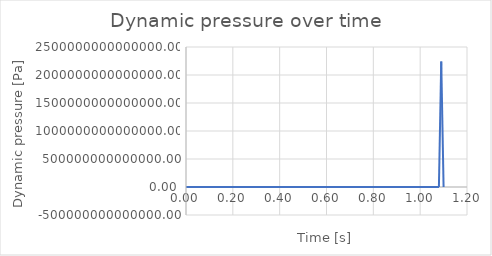
| Category | Series 0 |
|---|---|
| 0.0 | 119253.87 |
| 0.01 | 116545.592 |
| 0.02 | 95735.34 |
| 0.03 | 57701.717 |
| 0.04 | 25837.744 |
| 0.05 | 10615.93 |
| 0.060000000000000005 | 4652.437 |
| 0.07 | 2567.256 |
| 0.08 | 1587.92 |
| 0.09 | 1059.674 |
| 0.09999999999999999 | 749.017 |
| 0.10999999999999999 | 554.877 |
| 0.11999999999999998 | 427.903 |
| 0.12999999999999998 | 341.877 |
| 0.13999999999999999 | 281.954 |
| 0.15 | 239.293 |
| 0.16 | 208.404 |
| 0.17 | 185.759 |
| 0.18000000000000002 | 169.015 |
| 0.19000000000000003 | 156.572 |
| 0.20000000000000004 | 147.313 |
| 0.21000000000000005 | 140.433 |
| 0.22000000000000006 | 135.344 |
| 0.23000000000000007 | 131.606 |
| 0.24000000000000007 | 128.885 |
| 0.25000000000000006 | 126.929 |
| 0.26000000000000006 | 125.539 |
| 0.2700000000000001 | 124.568 |
| 0.2800000000000001 | 123.899 |
| 0.2900000000000001 | 123.447 |
| 0.3000000000000001 | 123.146 |
| 0.3100000000000001 | 122.95 |
| 0.3200000000000001 | 122.825 |
| 0.3300000000000001 | 122.746 |
| 0.34000000000000014 | 122.698 |
| 0.35000000000000014 | 122.669 |
| 0.36000000000000015 | 122.652 |
| 0.37000000000000016 | 122.642 |
| 0.38000000000000017 | 122.637 |
| 0.3900000000000002 | 122.634 |
| 0.4000000000000002 | 122.632 |
| 0.4100000000000002 | 122.631 |
| 0.4200000000000002 | 122.63 |
| 0.4300000000000002 | 122.63 |
| 0.4400000000000002 | 122.63 |
| 0.45000000000000023 | 122.63 |
| 0.46000000000000024 | 122.629 |
| 0.47000000000000025 | 122.629 |
| 0.48000000000000026 | 122.629 |
| 0.49000000000000027 | 122.629 |
| 0.5000000000000002 | 122.629 |
| 0.5100000000000002 | 122.629 |
| 0.5200000000000002 | 122.629 |
| 0.5300000000000002 | 122.629 |
| 0.5400000000000003 | 122.629 |
| 0.5500000000000003 | 122.629 |
| 0.5600000000000003 | 107.348 |
| 0.5700000000000003 | 91.636 |
| 0.5800000000000003 | 79.435 |
| 0.5900000000000003 | 70.181 |
| 0.6000000000000003 | 62.948 |
| 0.6100000000000003 | 57.12 |
| 0.6200000000000003 | 52.315 |
| 0.6300000000000003 | 48.278 |
| 0.6400000000000003 | 44.835 |
| 0.6500000000000004 | 41.862 |
| 0.6600000000000004 | 39.267 |
| 0.6700000000000004 | 36.981 |
| 0.6800000000000004 | 34.951 |
| 0.6900000000000004 | 33.136 |
| 0.7000000000000004 | 31.503 |
| 0.7100000000000004 | 30.026 |
| 0.7200000000000004 | 28.683 |
| 0.7300000000000004 | 27.457 |
| 0.7400000000000004 | 26.332 |
| 0.7500000000000004 | 25.297 |
| 0.7600000000000005 | 24.341 |
| 0.7700000000000005 | 23.456 |
| 0.7800000000000005 | 22.633 |
| 0.7900000000000005 | 21.867 |
| 0.8000000000000005 | 21.151 |
| 0.8100000000000005 | 20.481 |
| 0.8200000000000005 | 19.853 |
| 0.8300000000000005 | 19.262 |
| 0.8400000000000005 | 18.705 |
| 0.8500000000000005 | 18.181 |
| 0.8600000000000005 | 17.685 |
| 0.8700000000000006 | 17.215 |
| 0.8800000000000006 | 16.77 |
| 0.8900000000000006 | 16.347 |
| 0.9000000000000006 | 15.946 |
| 0.9100000000000006 | 15.564 |
| 0.9200000000000006 | 15.199 |
| 0.9300000000000006 | 14.852 |
| 0.9400000000000006 | 14.52 |
| 0.9500000000000006 | 14.203 |
| 0.9600000000000006 | 13.899 |
| 0.9700000000000006 | 13.608 |
| 0.9800000000000006 | 13.329 |
| 0.9900000000000007 | 13.062 |
| 1.0000000000000007 | 12.804 |
| 1.0100000000000007 | 13.529 |
| 1.0200000000000007 | 11.51 |
| 1.0300000000000007 | 17.567 |
| 1.0400000000000007 | 2.909 |
| 1.0500000000000007 | 52.413 |
| 1.0600000000000007 | 213.127 |
| 1.0700000000000007 | 16006.81 |
| 1.0800000000000007 | 83780293.371 |
| 1.0900000000000007 | 2240918655508406 |
| 1.1000000000000008 | 0 |